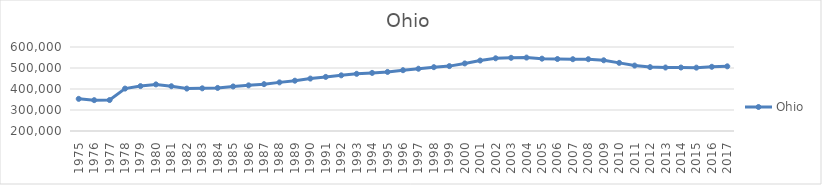
| Category | Ohio |
|---|---|
| 1975 | 353052 |
| 1976 | 346904 |
| 1977 | 347416 |
| 1978 | 401971 |
| 1979 | 413813 |
| 1980 | 421969 |
| 1981 | 413183 |
| 1982 | 401958 |
| 1983 | 403225 |
| 1984 | 405089 |
| 1985 | 412067 |
| 1986 | 417310 |
| 1987 | 423086 |
| 1988 | 431510 |
| 1989 | 439522 |
| 1990 | 449601 |
| 1991 | 457617 |
| 1992 | 465085 |
| 1993 | 472305 |
| 1994 | 476611 |
| 1995 | 481302 |
| 1996 | 489514 |
| 1997 | 496509 |
| 1998 | 503970 |
| 1999 | 509028 |
| 2000 | 521726 |
| 2001 | 535517 |
| 2002 | 546243 |
| 2003 | 548484 |
| 2004 | 549641 |
| 2005 | 544479 |
| 2006 | 542820 |
| 2007 | 541882 |
| 2008 | 541952 |
| 2009 | 536772 |
| 2010 | 524461 |
| 2011 | 511585 |
| 2012 | 504220 |
| 2013 | 502311 |
| 2014 | 502270 |
| 2015 | 501690 |
| 2016 | 505768 |
| 2017 | 507934 |